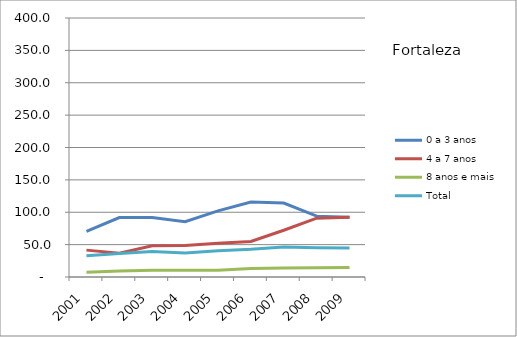
| Category | 0 a 3 anos | 4 a 7 anos | 8 anos e mais | Total |
|---|---|---|---|---|
| 2001.0 | 70.5 | 41.5 | 7.3 | 32.9 |
| 2002.0 | 91.8 | 36.7 | 9.3 | 36.2 |
| 2003.0 | 91.9 | 48.1 | 10.4 | 39.5 |
| 2004.0 | 85.4 | 48.8 | 10.4 | 37 |
| 2005.0 | 102.1 | 52.1 | 10.4 | 40.7 |
| 2006.0 | 115.9 | 54.8 | 13.1 | 42.9 |
| 2007.0 | 114.2 | 72.2 | 13.9 | 46.5 |
| 2008.0 | 94 | 90.9 | 14.4 | 45.3 |
| 2009.0 | 92.2 | 92.1 | 14.7 | 44.8 |